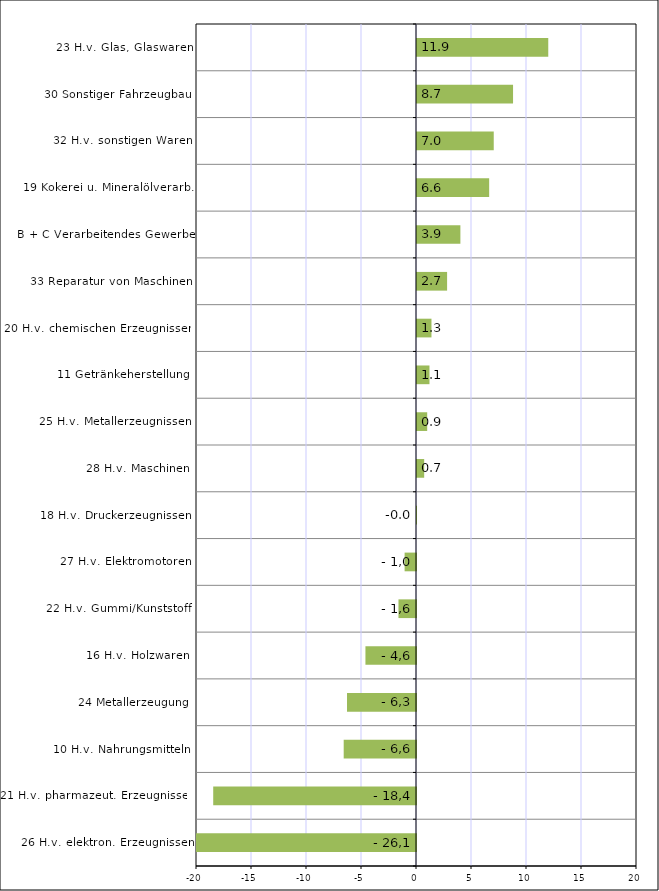
| Category | Series 2 |
|---|---|
| 26 H.v. elektron. Erzeugnissen | -26.128 |
| 21 H.v. pharmazeut. Erzeugnissen | -18.435 |
| 10 H.v. Nahrungsmitteln | -6.573 |
| 24 Metallerzeugung | -6.272 |
| 16 H.v. Holzwaren | -4.596 |
| 22 H.v. Gummi/Kunststoff | -1.593 |
| 27 H.v. Elektromotoren | -1.035 |
| 18 H.v. Druckerzeugnissen | -0.002 |
| 28 H.v. Maschinen | 0.653 |
| 25 H.v. Metallerzeugnissen | 0.926 |
| 11 Getränkeherstellung | 1.134 |
| 20 H.v. chemischen Erzeugnissen | 1.316 |
| 33 Reparatur von Maschinen | 2.736 |
| B + C Verarbeitendes Gewerbe | 3.944 |
| 19 Kokerei u. Mineralölverarb. | 6.561 |
| 32 H.v. sonstigen Waren | 6.977 |
| 30 Sonstiger Fahrzeugbau | 8.732 |
| 23 H.v. Glas, Glaswaren | 11.933 |